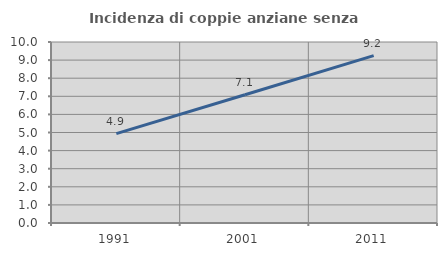
| Category | Incidenza di coppie anziane senza figli  |
|---|---|
| 1991.0 | 4.941 |
| 2001.0 | 7.083 |
| 2011.0 | 9.245 |